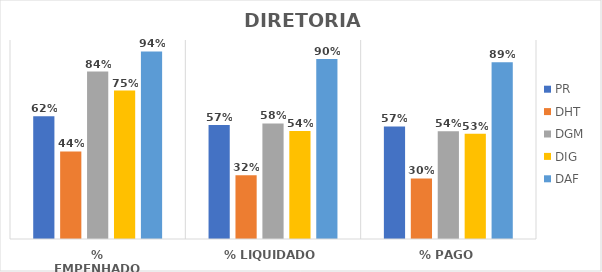
| Category | PR | DHT | DGM | DIG | DAF |
|---|---|---|---|---|---|
| % EMPENHADO | 0.616 | 0.44 | 0.841 | 0.746 | 0.942 |
| % LIQUIDADO | 0.573 | 0.32 | 0.581 | 0.543 | 0.904 |
| % PAGO | 0.566 | 0.304 | 0.541 | 0.528 | 0.888 |